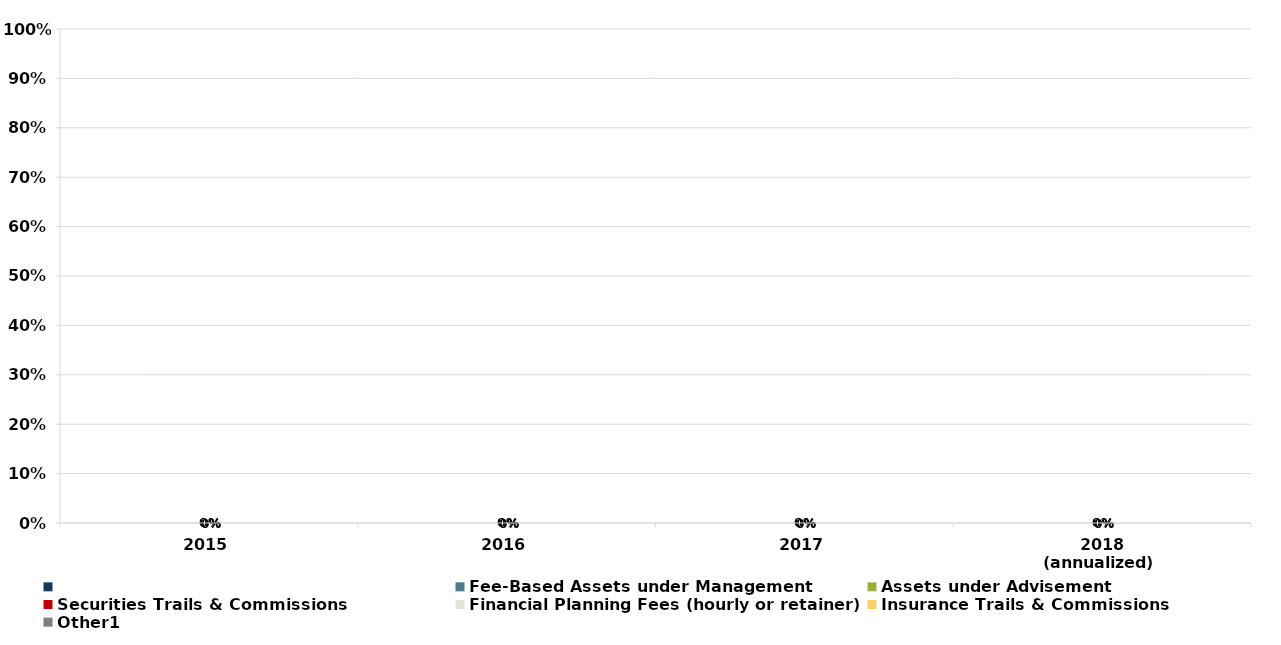
| Category | Series 6 | Fee-Based Assets under Management | Assets under Advisement | Securities Trails & Commissions | Financial Planning Fees (hourly or retainer) | Insurance Trails & Commissions | Other1 |
|---|---|---|---|---|---|---|---|
| 2015 |  | 0 | 0 | 0 | 0 | 0 | 0 |
| 2016 |  | 0 | 0 | 0 | 0 | 0 | 0 |
| 2017 |  | 0 | 0 | 0 | 0 | 0 | 0 |
| 2018 (annualized)  |  | 0 | 0 | 0 | 0 | 0 | 0 |